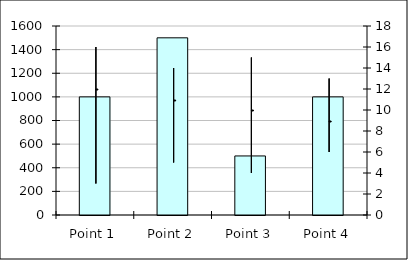
| Category | Volume |
|---|---|
| Point 1 | 1000 |
| Point 2 | 1500 |
| Point 3 | 500 |
| Point 4 | 1000 |